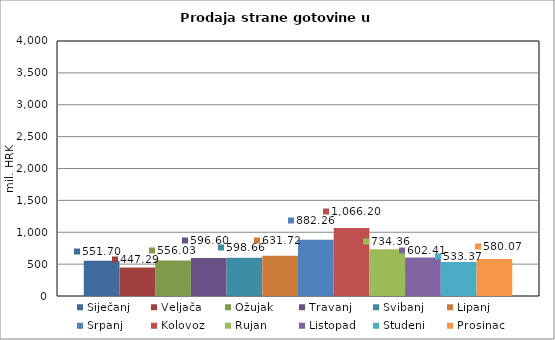
| Category | Siječanj | Veljača | Ožujak | Travanj | Svibanj | Lipanj | Srpanj | Kolovoz | Rujan | Listopad | Studeni | Prosinac |
|---|---|---|---|---|---|---|---|---|---|---|---|---|
| 0 | 551.698 | 447.287 | 556.034 | 596.603 | 598.658 | 631.723 | 882.263 | 1066.196 | 734.356 | 602.412 | 533.366 | 580.067 |